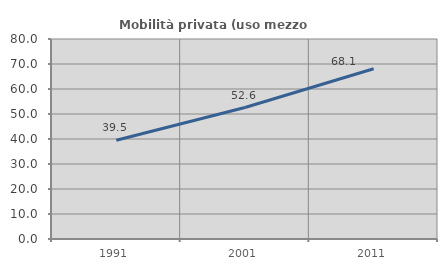
| Category | Mobilità privata (uso mezzo privato) |
|---|---|
| 1991.0 | 39.516 |
| 2001.0 | 52.577 |
| 2011.0 | 68.098 |